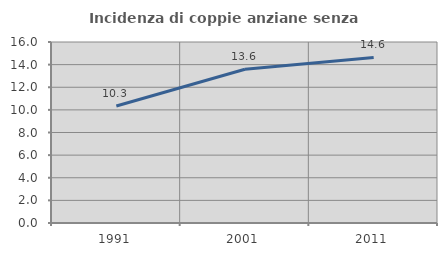
| Category | Incidenza di coppie anziane senza figli  |
|---|---|
| 1991.0 | 10.345 |
| 2001.0 | 13.59 |
| 2011.0 | 14.634 |